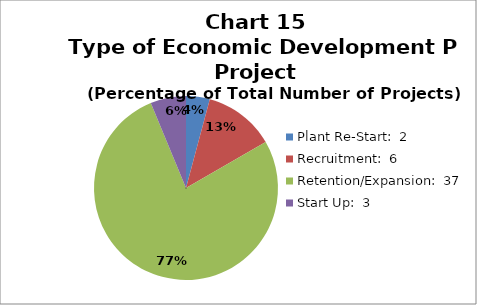
| Category | Series 0 | Series 1 |
|---|---|---|
| Plant Re-Start:  2 | 2 | 0.042 |
| Recruitment:  6 | 6 | 0.125 |
| Retention/Expansion:  37 | 37 | 0.771 |
| Start Up:  3 | 3 | 0.062 |